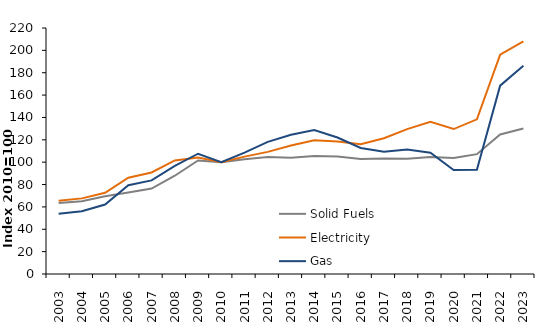
| Category | Solid Fuels | Electricity | Gas |
|---|---|---|---|
| 2003.0 | 63.425 | 65.457 | 53.798 |
| 2004.0 | 65.082 | 67.631 | 56.082 |
| 2005.0 | 69.584 | 72.589 | 62.178 |
| 2006.0 | 72.934 | 86.057 | 79.426 |
| 2007.0 | 76.394 | 90.834 | 83.708 |
| 2008.0 | 87.881 | 101.519 | 96.679 |
| 2009.0 | 101.542 | 104.142 | 107.57 |
| 2010.0 | 100 | 100 | 100 |
| 2011.0 | 102.603 | 104.968 | 108.541 |
| 2012.0 | 104.603 | 109.233 | 118.143 |
| 2013.0 | 104.018 | 114.92 | 124.508 |
| 2014.0 | 105.515 | 119.621 | 128.658 |
| 2015.0 | 105.04 | 118.49 | 122.085 |
| 2016.0 | 102.829 | 115.996 | 112.689 |
| 2017.0 | 103.229 | 121.464 | 109.286 |
| 2018.0 | 103.018 | 129.531 | 111.429 |
| 2019.0 | 104.547 | 136.017 | 108.525 |
| 2020.0 | 103.726 | 129.626 | 92.943 |
| 2021.0 | 107.156 | 138.309 | 93.247 |
| 2022.0 | 124.797 | 196.074 | 168.473 |
| 2023.0 | 130.179 | 208.088 | 186.146 |